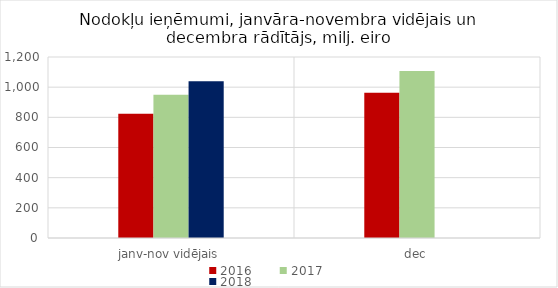
| Category | 2016 | 2017 | 2018 |
|---|---|---|---|
| janv-nov vidējais | 824369.827 | 949988.056 | 1038563.204 |
| dec | 962936.043 | 1107409.079 | 0 |